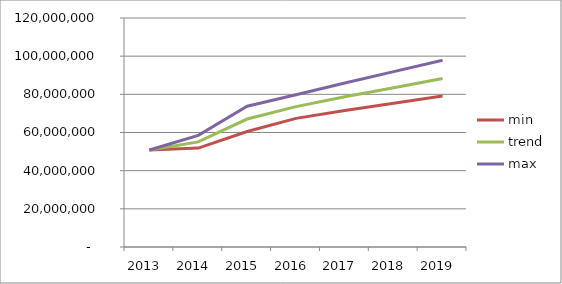
| Category |  min  |  trend  |  max  |
|---|---|---|---|
| 2013.0 | 50802611.711 | 50802611.711 | 50802611.711 |
| 2014.0 | 51853410.101 | 55073894.484 | 58516770.467 |
| 2015.0 | 60528796.372 | 67060997.156 | 73740133.13 |
| 2016.0 | 67392461.253 | 73558061.869 | 79784767.93 |
| 2017.0 | 71559142.609 | 78685273.697 | 85974265.753 |
| 2018.0 | 75359943.172 | 83485855.918 | 91886357.436 |
| 2019.0 | 79107448.42 | 88303500.798 | 97898977.786 |